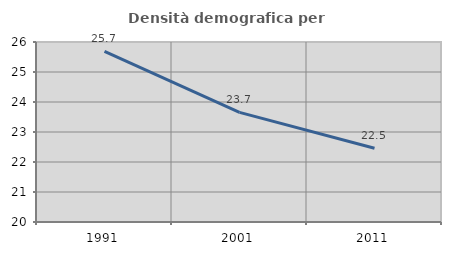
| Category | Densità demografica |
|---|---|
| 1991.0 | 25.691 |
| 2001.0 | 23.654 |
| 2011.0 | 22.46 |